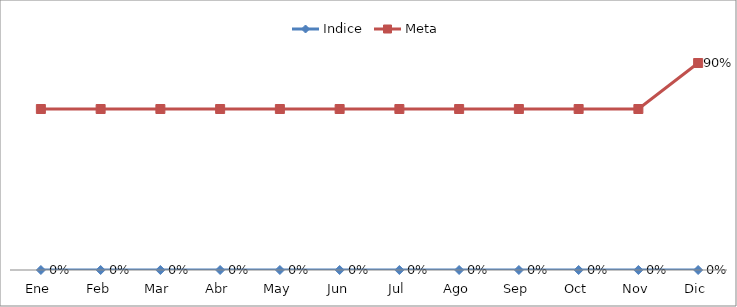
| Category | Indice | Meta |
|---|---|---|
| Ene | 0 | 0.7 |
| Feb | 0 | 0.7 |
| Mar | 0 | 0.7 |
| Abr | 0 | 0.7 |
| May | 0 | 0.7 |
| Jun | 0 | 0.7 |
| Jul | 0 | 0.7 |
| Ago | 0 | 0.7 |
| Sep | 0 | 0.7 |
| Oct | 0 | 0.7 |
| Nov | 0 | 0.7 |
| Dic | 0 | 0.9 |